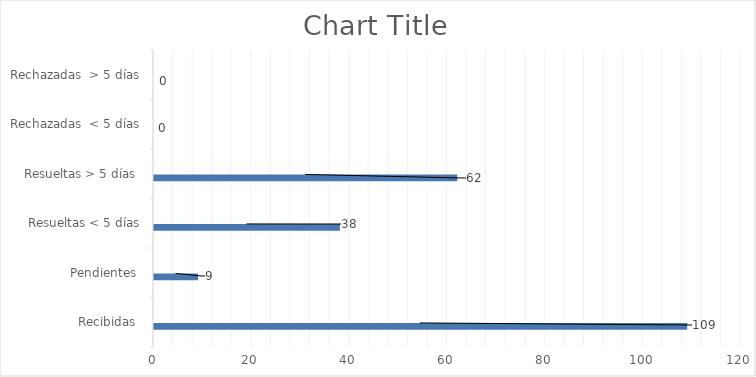
| Category | Física | PORTAL SAIP | 311 | Otras |
|---|---|---|---|---|
| Recibidas  | 0 | 109 | 0 | 0 |
| Pendientes  | 0 | 9 | 0 | 0 |
| Resueltas < 5 días | 0 | 38 | 0 | 0 |
| Resueltas > 5 días  | 0 | 62 | 0 | 0 |
| Rechazadas  < 5 días | 0 | 0 | 0 | 0 |
| Rechazadas  > 5 días | 0 | 0 | 0 | 0 |